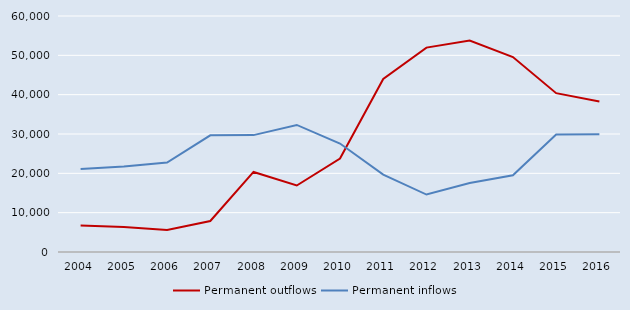
| Category | Permanent outflows | Permanent inflows |
|---|---|---|
| 2004.0 | 6757 | 21093 |
| 2005.0 | 6360 | 21741 |
| 2006.0 | 5600 | 22741 |
| 2007.0 | 7890 | 29661 |
| 2008.0 | 20357 | 29718 |
| 2009.0 | 16899 | 32307 |
| 2010.0 | 23760 | 27575 |
| 2011.0 | 43998 | 19667 |
| 2012.0 | 51958 | 14606 |
| 2013.0 | 53786 | 17554 |
| 2014.0 | 49572 | 19516 |
| 2015.0 | 40377 | 29896 |
| 2016.0 | 38273 | 29925 |